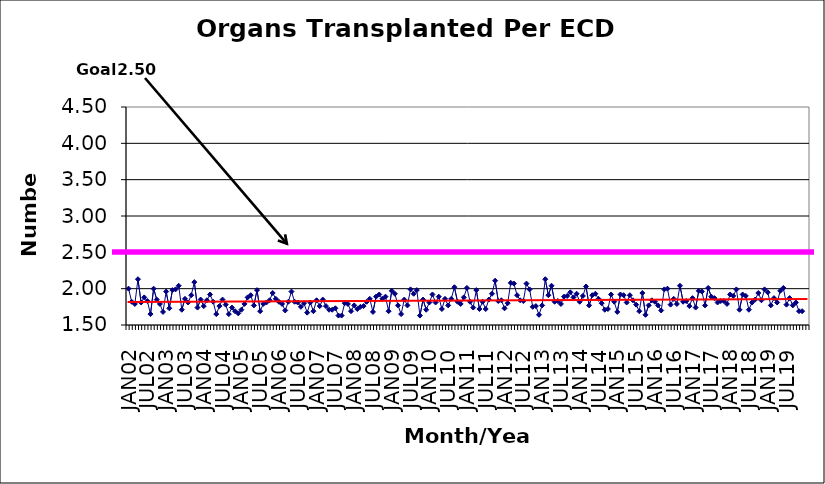
| Category | Series 0 |
|---|---|
| JAN02 | 2 |
| FEB02 | 1.82 |
| MAR02 | 1.79 |
| APR02 | 2.13 |
| MAY02 | 1.81 |
| JUN02 | 1.88 |
| JUL02 | 1.83 |
| AUG02 | 1.65 |
| SEP02 | 2 |
| OCT02 | 1.85 |
| NOV02 | 1.79 |
| DEC02 | 1.68 |
| JAN03 | 1.96 |
| FEB03 | 1.73 |
| MAR03 | 1.98 |
| APR03 | 1.99 |
| MAY03 | 2.04 |
| JUN03 | 1.71 |
| JUL03 | 1.86 |
| AUG03 | 1.81 |
| SEP03 | 1.91 |
| OCT03 | 2.09 |
| NOV03 | 1.74 |
| DEC03 | 1.85 |
| JAN04 | 1.76 |
| FEB04 | 1.84 |
| MAR04 | 1.92 |
| APR04 | 1.82 |
| MAY04 | 1.65 |
| JUN04 | 1.76 |
| JUL04 | 1.85 |
| AUG04 | 1.78 |
| SEP04 | 1.65 |
| OCT04 | 1.74 |
| NOV04 | 1.69 |
| DEC04 | 1.66 |
| JAN05 | 1.71 |
| FEB05 | 1.79 |
| MAR05 | 1.88 |
| APR05 | 1.91 |
| MAY05 | 1.77 |
| JUN05 | 1.98 |
| JUL05 | 1.69 |
| AUG05 | 1.79 |
| SEP05 | 1.81 |
| OCT05 | 1.84 |
| NOV05 | 1.94 |
| DEC05 | 1.86 |
| JAN06 | 1.82 |
| FEB06 | 1.79 |
| MAR06 | 1.7 |
| APR06 | 1.82 |
| MAY06 | 1.96 |
| JUN06 | 1.82 |
| JUL06 | 1.81 |
| AUG06 | 1.75 |
| SEP06 | 1.8 |
| OCT06 | 1.67 |
| NOV06 | 1.81 |
| DEC06 | 1.69 |
| JAN07 | 1.84 |
| FEB07 | 1.76 |
| MAR07 | 1.85 |
| APR07 | 1.76 |
| MAY07 | 1.71 |
| JUN07 | 1.71 |
| JUL07 | 1.73 |
| AUG07 | 1.63 |
| SEP07 | 1.63 |
| OCT07 | 1.8 |
| NOV07 | 1.79 |
| DEC07 | 1.69 |
| JAN08 | 1.77 |
| FEB08 | 1.72 |
| MAR08 | 1.75 |
| APR08 | 1.76 |
| MAY08 | 1.82 |
| JUN08 | 1.86 |
| JUL08 | 1.68 |
| AUG08 | 1.89 |
| SEP08 | 1.92 |
| OCT08 | 1.86 |
| NOV08 | 1.89 |
| DEC08 | 1.69 |
| JAN09 | 1.97 |
| FEB09 | 1.93 |
| MAR09 | 1.77 |
| APR09 | 1.65 |
| MAY09 | 1.85 |
| JUN09 | 1.77 |
| JUL09 | 1.99 |
| AUG09 | 1.93 |
| SEP09 | 1.98 |
| OCT09 | 1.63 |
| NOV09 | 1.85 |
| DEC09 | 1.71 |
| JAN10 | 1.81 |
| FEB10 | 1.92 |
| MAR10 | 1.81 |
| APR10 | 1.89 |
| MAY10 | 1.72 |
| JUN10 | 1.86 |
| JUL10 | 1.77 |
| AUG10 | 1.86 |
| SEP10 | 2.02 |
| OCT10 | 1.82 |
| NOV10 | 1.79 |
| DEC10 | 1.88 |
| JAN11 | 2.01 |
| FEB11 | 1.82 |
| MAR11 | 1.74 |
| APR11 | 1.98 |
| MAY11 | 1.72 |
| JUN11 | 1.82 |
| JUL11 | 1.72 |
| AUG11 | 1.85 |
| SEP11 | 1.93 |
| OCT11 | 2.11 |
| NOV11 | 1.83 |
| DEC11 | 1.84 |
| JAN12 | 1.73 |
| FEB12 | 1.8 |
| MAR12 | 2.08 |
| APR12 | 2.07 |
| MAY12 | 1.91 |
| JUN12 | 1.84 |
| JUL12 | 1.83 |
| AUG12 | 2.07 |
| SEP12 | 1.99 |
| OCT12 | 1.75 |
| NOV12 | 1.76 |
| DEC12 | 1.64 |
| JAN13 | 1.77 |
| FEB13 | 2.13 |
| MAR13 | 1.91 |
| APR13 | 2.04 |
| MAY13 | 1.82 |
| JUN13 | 1.83 |
| JUL13 | 1.79 |
| AUG13 | 1.89 |
| SEP13 | 1.9 |
| OCT13 | 1.95 |
| NOV13 | 1.88 |
| DEC13 | 1.93 |
| JAN14 | 1.82 |
| FEB14 | 1.9 |
| MAR14 | 2.03 |
| APR14 | 1.77 |
| MAY14 | 1.91 |
| JUN14 | 1.93 |
| JUL14 | 1.86 |
| AUG14 | 1.8 |
| SEP14 | 1.71 |
| OCT14 | 1.72 |
| NOV14 | 1.92 |
| DEC14 | 1.82 |
| JAN15 | 1.68 |
| FEB15 | 1.92 |
| MAR15 | 1.91 |
| APR15 | 1.81 |
| MAY15 | 1.91 |
| JUN15 | 1.84 |
| JUL15 | 1.78 |
| AUG15 | 1.69 |
| SEP15 | 1.94 |
| OCT15 | 1.64 |
| NOV15 | 1.77 |
| DEC15 | 1.84 |
| JAN16 | 1.82 |
| FEB16 | 1.77 |
| MAR16 | 1.7 |
| APR16 | 1.99 |
| MAY16 | 2 |
| JUN16 | 1.78 |
| JUL16 | 1.86 |
| AUG16 | 1.79 |
| SEP16 | 2.04 |
| OCT16 | 1.82 |
| NOV16 | 1.83 |
| DEC16 | 1.76 |
| JAN17 | 1.87 |
| FEB17 | 1.74 |
| MAR17 | 1.97 |
| APR17 | 1.96 |
| MAY17 | 1.77 |
| JUN17 | 2.01 |
| JUL17 | 1.89 |
| AUG17 | 1.87 |
| SEP17 | 1.81 |
| OCT17 | 1.83 |
| NOV17 | 1.83 |
| DEC17 | 1.79 |
| JAN18 | 1.92 |
| FEB18 | 1.9 |
| MAR18 | 1.99 |
| APR18 | 1.71 |
| MAY18 | 1.92 |
| JUN18 | 1.9 |
| JUL18 | 1.71 |
| AUG18 | 1.81 |
| SEP18 | 1.85 |
| OCT18 | 1.94 |
| NOV18 | 1.84 |
| DEC18 | 1.99 |
| JAN19 | 1.95 |
| FEB19 | 1.77 |
| MAR19 | 1.87 |
| APR19 | 1.81 |
| MAY19 | 1.97 |
| JUN19 | 2.01 |
| JUL19 | 1.78 |
| AUG19 | 1.87 |
| SEP19 | 1.77 |
| OCT19 | 1.81 |
| NOV19 | 1.69 |
| DEC19 | 1.69 |